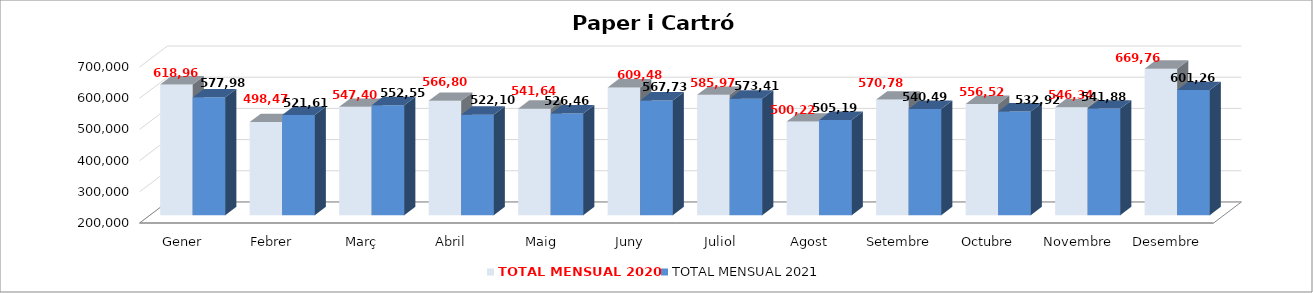
| Category | TOTAL MENSUAL 2020 | TOTAL MENSUAL 2021 |
|---|---|---|
| Gener | 618960 | 577980 |
| Febrer | 498470.26 | 521609.99 |
| Març | 547400.02 | 552550 |
| Abril | 566800 | 522102 |
| Maig | 541640.01 | 526460.98 |
| Juny | 609488.57 | 567729.97 |
| Juliol | 585970.05 | 573418.98 |
| Agost | 500221.01 | 505190.02 |
| Setembre | 570779.96 | 540496.64 |
| Octubre | 556520.02 | 532923.99 |
| Novembre | 546339.99 | 541879.51 |
| Desembre | 669765.97 | 601263 |